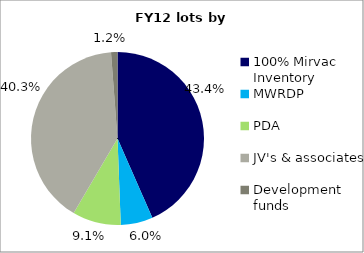
| Category | Series 0 |
|---|---|
| 100% Mirvac Inventory | 0.434 |
| MWRDP | 0.06 |
| PDA | 0.091 |
| JV's & associates | 0.403 |
| Development funds | 0.012 |